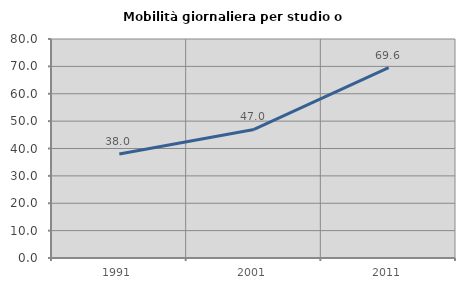
| Category | Mobilità giornaliera per studio o lavoro |
|---|---|
| 1991.0 | 37.963 |
| 2001.0 | 46.957 |
| 2011.0 | 69.565 |